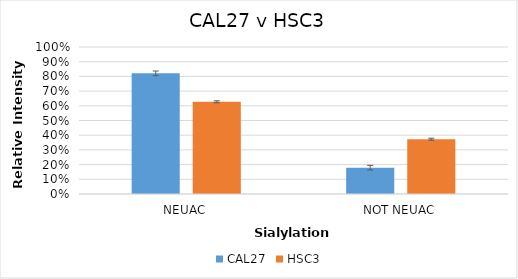
| Category | CAL27 | HSC3 |
|---|---|---|
| NEUAC | 0.821 | 0.627 |
| NOT NEUAC | 0.179 | 0.373 |